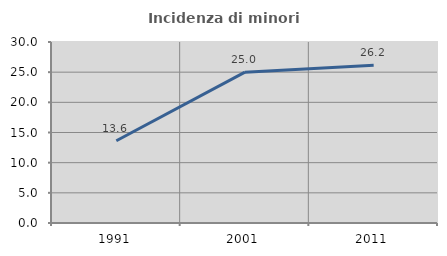
| Category | Incidenza di minori stranieri |
|---|---|
| 1991.0 | 13.636 |
| 2001.0 | 25 |
| 2011.0 | 26.164 |